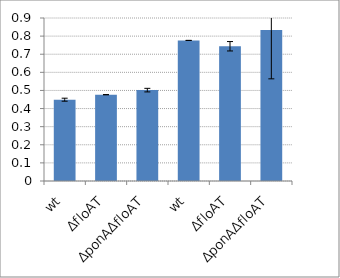
| Category | Series 0 |
|---|---|
| wt | 0.449 |
| ΔfloAT | 0.477 |
| ΔponAΔfloAT | 0.502 |
| wt | 0.776 |
| ΔfloAT | 0.744 |
| ΔponAΔfloAT | 0.833 |